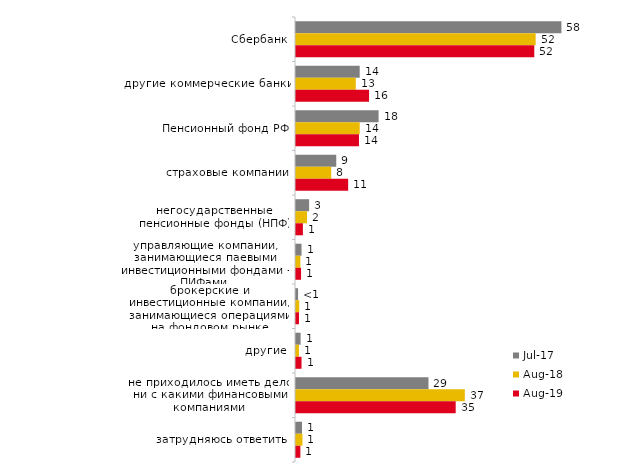
| Category | июл.17 | авг.18 | авг.19 |
|---|---|---|---|
| Сбербанк | 57.7 | 52.1 | 51.798 |
| другие коммерческие банки | 13.85 | 13 | 15.884 |
| Пенсионный фонд РФ | 17.95 | 13.85 | 13.686 |
| страховые компании | 8.75 | 7.65 | 11.339 |
| негосударственные пенсионные фонды (НПФ) | 2.85 | 2.4 | 1.499 |
| управляющие компании, занимающиеся паевыми инвестиционными фондами - ПИФами | 1.2 | 0.95 | 1.099 |
| брокерские и инвестиционные компании, занимающиеся операциями на фондовом рынке | 0.45 | 0.7 | 0.649 |
| другие | 1 | 0.65 | 1.199 |
| не приходилось иметь дело ни с какими финансовыми компаниями | 28.8 | 36.7 | 34.715 |
| затрудняюсь ответить | 1.3 | 1.4 | 0.949 |